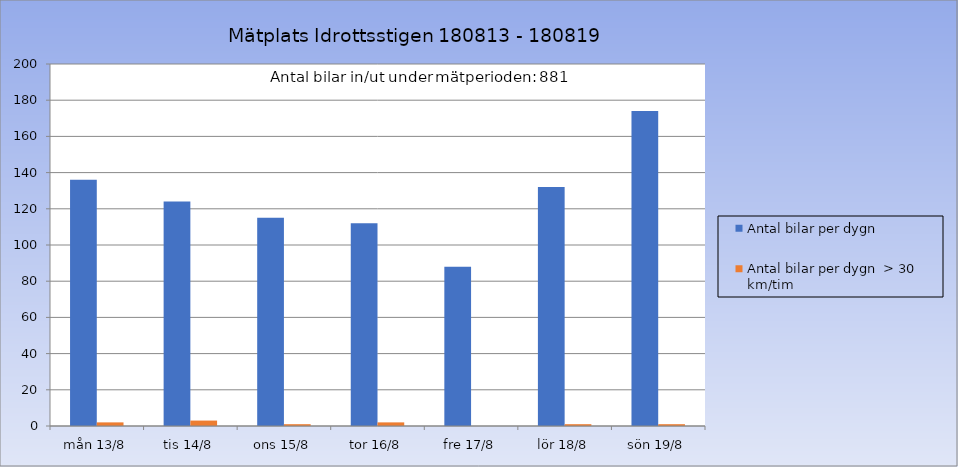
| Category | Antal bilar per dygn | Antal bilar per dygn  > 30 km/tim |
|---|---|---|
| mån 13/8 | 136 | 2 |
| tis 14/8 | 124 | 3 |
| ons 15/8 | 115 | 1 |
| tor 16/8 | 112 | 2 |
| fre 17/8 | 88 | 0 |
| lör 18/8 | 132 | 1 |
| sön 19/8 | 174 | 1 |